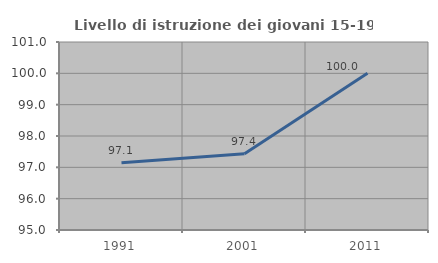
| Category | Livello di istruzione dei giovani 15-19 anni |
|---|---|
| 1991.0 | 97.143 |
| 2001.0 | 97.436 |
| 2011.0 | 100 |